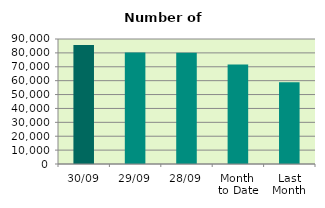
| Category | Series 0 |
|---|---|
| 30/09 | 85660 |
| 29/09 | 80356 |
| 28/09 | 80186 |
| Month 
to Date | 71692 |
| Last
Month | 58874.818 |